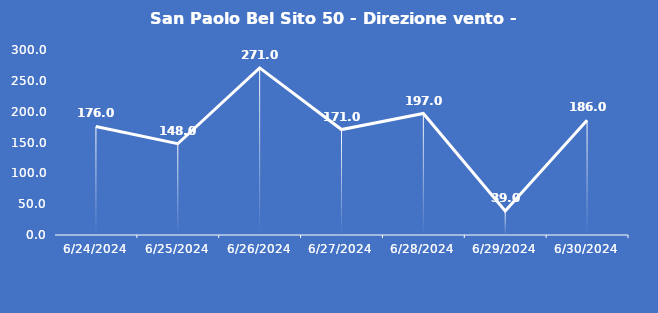
| Category | San Paolo Bel Sito 50 - Direzione vento - Grezzo (°N) |
|---|---|
| 6/24/24 | 176 |
| 6/25/24 | 148 |
| 6/26/24 | 271 |
| 6/27/24 | 171 |
| 6/28/24 | 197 |
| 6/29/24 | 39 |
| 6/30/24 | 186 |